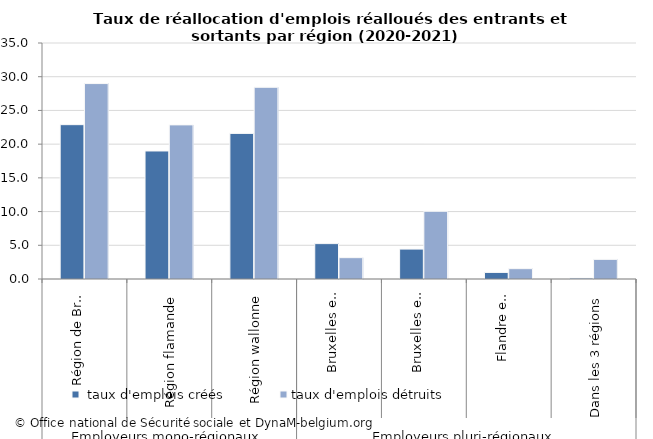
| Category |  taux d'emplois créés | taux d'emplois détruits |
|---|---|---|
| 0 | 22.888 | 28.983 |
| 1 | 18.986 | 22.855 |
| 2 | 21.594 | 28.433 |
| 3 | 5.247 | 3.164 |
| 4 | 4.439 | 10.042 |
| 5 | 0.974 | 1.533 |
| 6 | 0.138 | 2.912 |